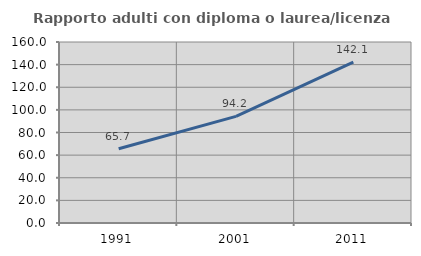
| Category | Rapporto adulti con diploma o laurea/licenza media  |
|---|---|
| 1991.0 | 65.655 |
| 2001.0 | 94.238 |
| 2011.0 | 142.126 |